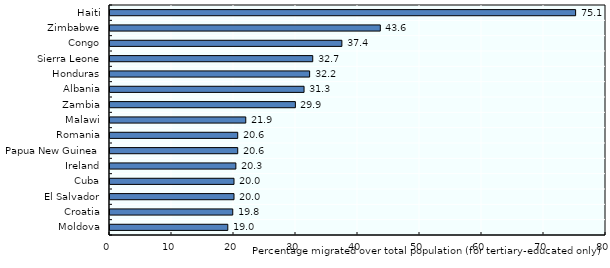
| Category | Series 0 |
|---|---|
| Moldova | 19 |
| Croatia | 19.8 |
| El Salvador | 20 |
| Cuba | 20 |
| Ireland | 20.3 |
| Papua New Guinea | 20.6 |
| Romania | 20.6 |
| Malawi | 21.9 |
| Zambia | 29.9 |
| Albania | 31.3 |
| Honduras | 32.2 |
| Sierra Leone | 32.7 |
| Congo | 37.4 |
| Zimbabwe | 43.6 |
| Haiti | 75.1 |